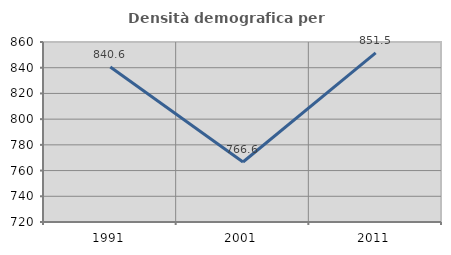
| Category | Densità demografica |
|---|---|
| 1991.0 | 840.561 |
| 2001.0 | 766.641 |
| 2011.0 | 851.539 |